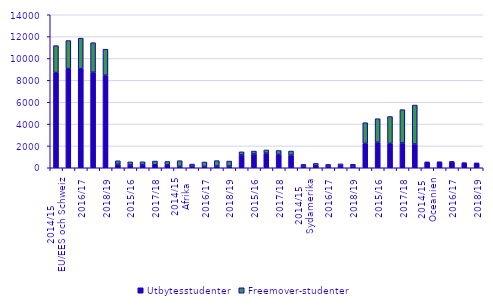
| Category | Utbytesstudenter | Freemover-studenter |
|---|---|---|
| 0 | 8715 | 2462 |
| 1 | 9080 | 2560 |
| 2 | 9068 | 2793 |
| 3 | 8740 | 2705 |
| 4 | 8466 | 2384 |
| 5 | 318 | 320 |
| 6 | 256 | 284 |
| 7 | 265 | 281 |
| 8 | 274 | 340 |
| 9 | 269 | 304 |
| 10 | 129 | 518 |
| 11 | 135 | 201 |
| 12 | 128 | 398 |
| 13 | 151 | 502 |
| 14 | 148 | 467 |
| 15 | 1173 | 284 |
| 16 | 1260 | 265 |
| 17 | 1341 | 288 |
| 18 | 1221 | 359 |
| 19 | 1156 | 373 |
| 20 | 158 | 150 |
| 21 | 178 | 218 |
| 22 | 154 | 152 |
| 23 | 168 | 188 |
| 24 | 163 | 160 |
| 25 | 2227 | 1894 |
| 26 | 2336 | 2153 |
| 27 | 2227 | 2461 |
| 28 | 2267 | 3050 |
| 29 | 2174 | 3564 |
| 30 | 486 | 31 |
| 31 | 497 | 28 |
| 32 | 528 | 25 |
| 33 | 416 | 23 |
| 34 | 394 | 25 |